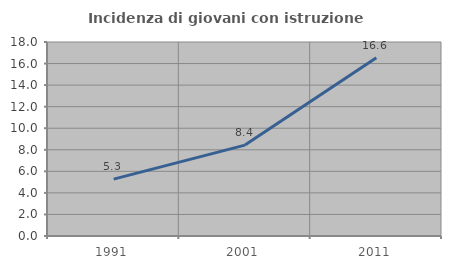
| Category | Incidenza di giovani con istruzione universitaria |
|---|---|
| 1991.0 | 5.274 |
| 2001.0 | 8.436 |
| 2011.0 | 16.55 |